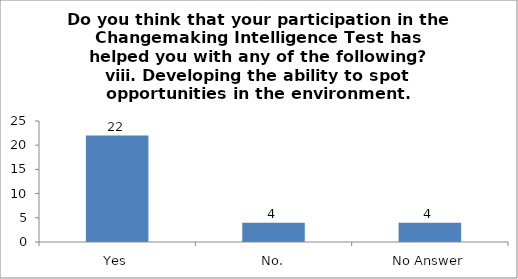
| Category | Do you think that your participation in the Changemaking Intelligence Test has helped you with any of the following?
viii. Developing the ability to spot opportunities in the environment. |
|---|---|
| Yes | 22 |
| No. | 4 |
| No Answer | 4 |